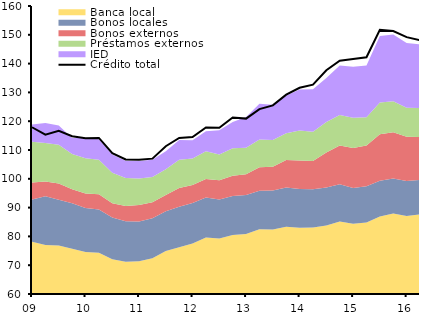
| Category | Crédito total |
|---|---|
| 09 | 117.9 |
| II | 115.3 |
| III | 116.7 |
| IV | 114.8 |
| 10 | 114.1 |
| II | 114.2 |
| III | 108.9 |
| IV | 106.7 |
| 11 | 106.6 |
| II | 107 |
| III | 111.3 |
| IV | 114.2 |
| 12 | 114.5 |
| II | 117.8 |
| III | 117.7 |
| IV | 121.3 |
| 13 | 120.9 |
| II | 124.2 |
| III | 125.5 |
| IV | 129.2 |
| 14 | 131.6 |
| II | 132.7 |
| III | 137.7 |
| IV | 141 |
| 15 | 141.6 |
| II | 142.2 |
| III | 151.7 |
| IV | 151.3 |
| 16 | 149.2 |
| II | 148.1 |